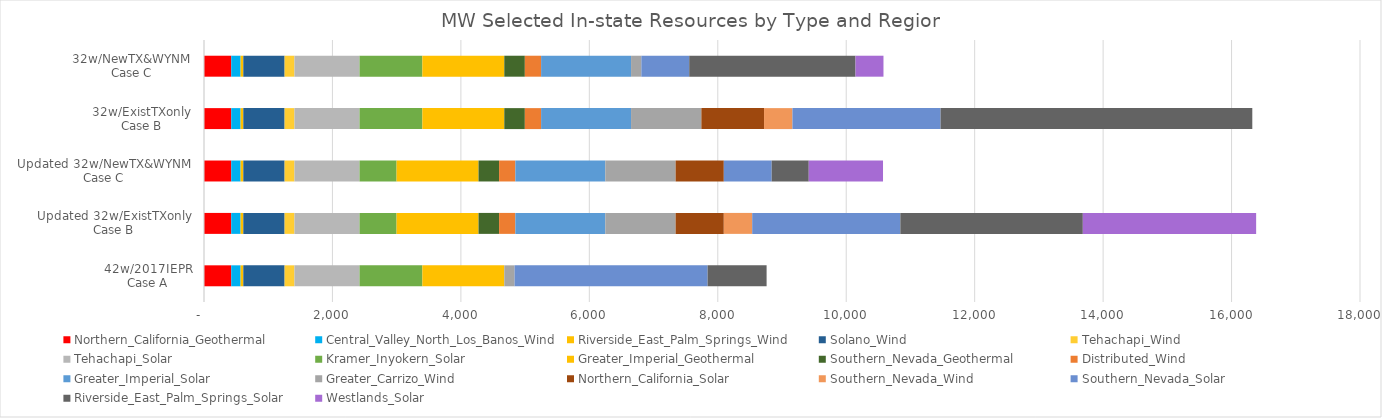
| Category | Northern_California_Geothermal | Central_Valley_North_Los_Banos_Wind | Riverside_East_Palm_Springs_Wind | Solano_Wind | Tehachapi_Wind | Tehachapi_Solar | Kramer_Inyokern_Solar | Greater_Imperial_Geothermal | Southern_Nevada_Geothermal | Distributed_Wind | Greater_Imperial_Solar | Greater_Carrizo_Wind | Northern_California_Solar | Southern_Nevada_Wind | Southern_Nevada_Solar | Riverside_East_Palm_Springs_Solar | Westlands_Solar |
|---|---|---|---|---|---|---|---|---|---|---|---|---|---|---|---|---|---|
| 42w/2017IEPR
Case A | 424 | 146 | 42.002 | 642.997 | 153.371 | 1013.221 | 978.283 | 1275.884 | 0 | 0 | 0 | 160.149 | 0 | 0 | 3005.93 | 918.474 | 0 |
| Updated 32w/ExistTXonly
Case B | 424 | 146 | 42.002 | 643.007 | 153.371 | 1013.221 | 577.208 | 1275.896 | 320 | 253.157 | 1400.775 | 1095 | 750.34 | 442.033 | 2306.62 | 2841.553 | 2698.615 |
| Updated 32w/NewTX&WYNM
Case C | 424 | 146 | 42.002 | 643.007 | 153.371 | 1013.221 | 577.208 | 1275.896 | 320 | 253.157 | 1400.775 | 1095 | 750.34 | 0 | 745.42 | 577.216 | 1156.175 |
| 32w/ExistTXonly
Case B | 424 | 146 | 42.002 | 642.997 | 153.371 | 1013.221 | 978.283 | 1275.896 | 320 | 253.157 | 1400.775 | 1095 | 975.698 | 442.033 | 2306.62 | 4853.984 | 0 |
| 32w/NewTX&WYNM
Case C | 424 | 146 | 42.002 | 642.997 | 153.371 | 1013.221 | 978.283 | 1275.896 | 320 | 253.157 | 1400.775 | 160.149 | 0 | 0 | 745.42 | 2589.647 | 435.173 |